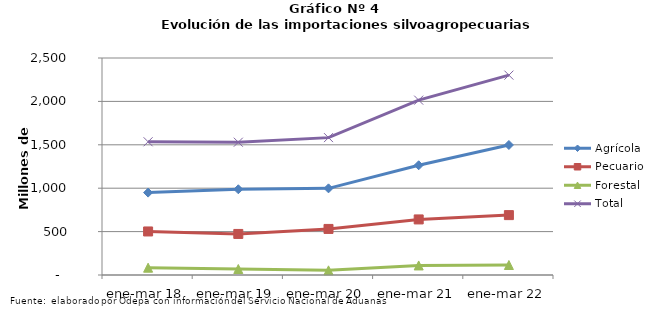
| Category | Agrícola | Pecuario | Forestal | Total |
|---|---|---|---|---|
| ene-mar 18 | 949131 | 501520 | 84236 | 1534887 |
| ene-mar 19 | 987677 | 472977 | 69124 | 1529778 |
| ene-mar 20 | 998186 | 530824 | 53671 | 1582681 |
| ene-mar 21 | 1264101 | 640271 | 110051 | 2014423 |
| ene-mar 22 | 1497706 | 689880 | 115091 | 2302677 |